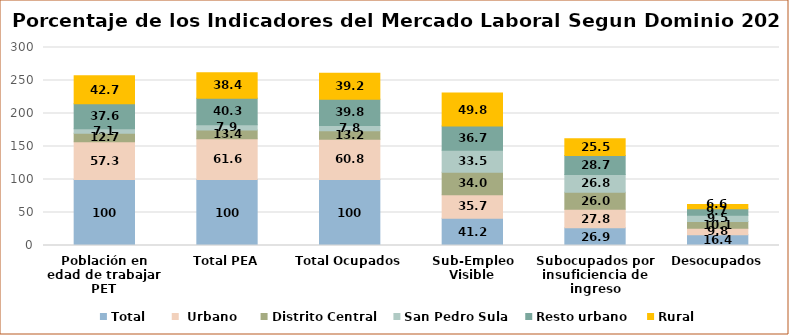
| Category | Total |  Urbano | Distrito Central | San Pedro Sula | Resto urbano | Rural |
|---|---|---|---|---|---|---|
| Población en edad de trabajar PET | 100 | 57.327 | 12.677 | 7.065 | 37.585 | 42.673 |
| Total PEA | 100 | 61.631 | 13.44 | 7.87 | 40.321 | 38.369 |
| Total Ocupados | 100 | 60.81 | 13.216 | 7.792 | 39.801 | 39.19 |
| Sub-Empleo Visible | 41.245 | 35.714 | 33.989 | 33.472 | 36.726 | 49.827 |
| Subocupados por insuficiencia de ingreso | 26.922 | 27.843 | 25.957 | 26.839 | 28.666 | 25.491 |
| Desocupados | 16.399 | 9.787 | 10.091 | 9.475 | 9.746 | 6.613 |